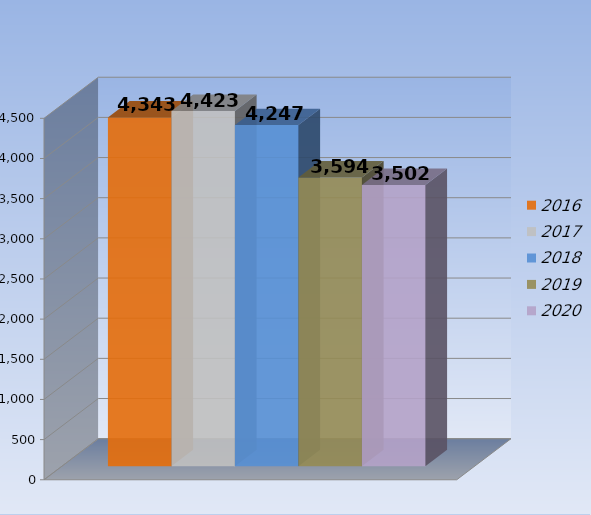
| Category | 2016 | 2017 | 2018 | 2019 | 2020 |
|---|---|---|---|---|---|
| 0 | 4343 | 4423 | 4247 | 3594 | 3502 |